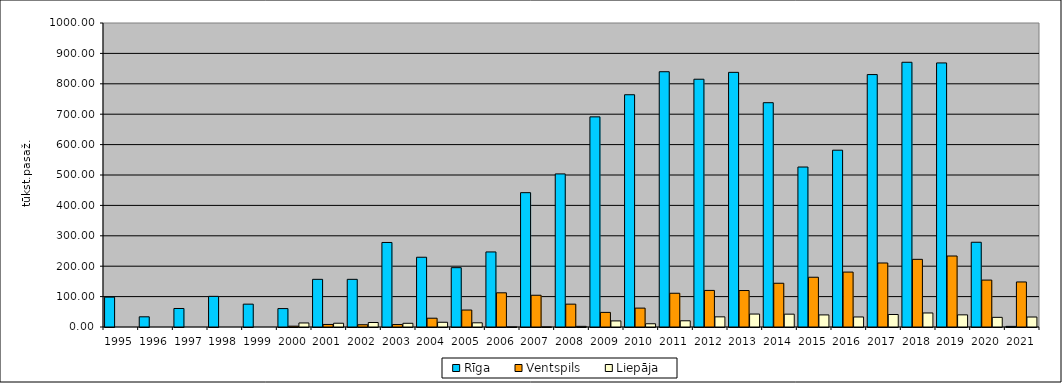
| Category | Rīga | Ventspils | Liepāja |
|---|---|---|---|
| 1995.0 | 98.19 | 0 | 0 |
| 1996.0 | 33.55 | 0 | 0 |
| 1997.0 | 60.88 | 0 | 0 |
| 1998.0 | 100.833 | 0 | 0 |
| 1999.0 | 75.147 | 0 | 0 |
| 2000.0 | 60.586 | 2.681 | 13.311 |
| 2001.0 | 156.77 | 8.37 | 12.356 |
| 2002.0 | 156.77 | 7.404 | 14.786 |
| 2003.0 | 278.028 | 8.032 | 12.162 |
| 2004.0 | 229.474 | 28.887 | 15.53 |
| 2005.0 | 195.195 | 55.788 | 13.812 |
| 2006.0 | 246.885 | 112.46 | 0.153 |
| 2007.0 | 441.914 | 104.422 | 0.116 |
| 2008.0 | 503.594 | 75.174 | 2.115 |
| 2009.0 | 691.236 | 48.012 | 20.041 |
| 2010.0 | 764.001 | 62.109 | 10.674 |
| 2011.0 | 839.712 | 111.019 | 20.432 |
| 2012.0 | 815.026 | 120.344 | 33.361 |
| 2013.0 | 837.665 | 120.014 | 42.607 |
| 2014.0 | 737.865 | 143.891 | 42.203 |
| 2015.0 | 526.243 | 163.666 | 39.782 |
| 2016.0 | 581.577 | 180.632 | 32.992 |
| 2017.0 | 830.38 | 210.532 | 41.111 |
| 2018.0 | 870.825 | 222.562 | 46.113 |
| 2019.0 | 868.656 | 233.537 | 39.987 |
| 2020.0 | 278.759 | 154.347 | 31.731 |
| 2021.0 | 2.005 | 148.167 | 32.808 |